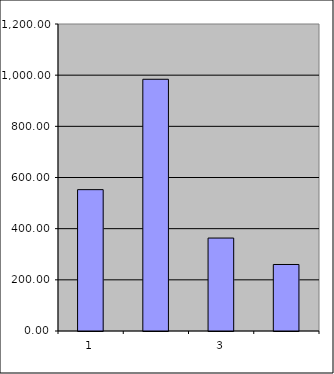
| Category | Series 0 |
|---|---|
| 0 | 552.5 |
| 1 | 983.945 |
| 2 | 363.278 |
| 3 | 259.987 |